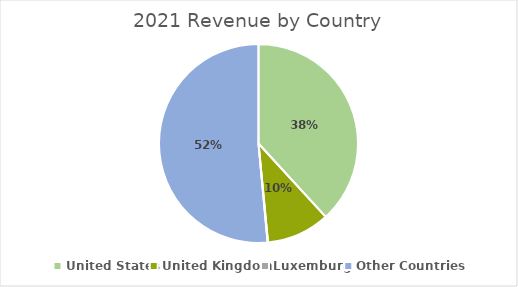
| Category | Series 0 |
|---|---|
| United States | 3692 |
| United Kingdom | 994 |
| Luxemburg | 6 |
| Other Countries | 4976 |